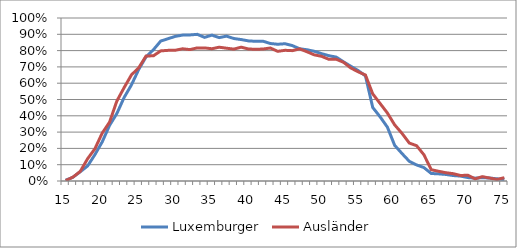
| Category | Luxemburger | Ausländer |
|---|---|---|
| 15.0 | 0.005 | 0.003 |
| 16.0 | 0.023 | 0.024 |
| 17.0 | 0.057 | 0.059 |
| 18.0 | 0.092 | 0.137 |
| 19.0 | 0.162 | 0.198 |
| 20.0 | 0.24 | 0.294 |
| 21.0 | 0.341 | 0.361 |
| 22.0 | 0.414 | 0.49 |
| 23.0 | 0.513 | 0.573 |
| 24.0 | 0.59 | 0.651 |
| 25.0 | 0.685 | 0.695 |
| 26.0 | 0.762 | 0.767 |
| 27.0 | 0.805 | 0.768 |
| 28.0 | 0.858 | 0.798 |
| 29.0 | 0.873 | 0.801 |
| 30.0 | 0.887 | 0.802 |
| 31.0 | 0.895 | 0.811 |
| 32.0 | 0.896 | 0.806 |
| 33.0 | 0.9 | 0.817 |
| 34.0 | 0.881 | 0.816 |
| 35.0 | 0.895 | 0.811 |
| 36.0 | 0.88 | 0.821 |
| 37.0 | 0.889 | 0.815 |
| 38.0 | 0.874 | 0.809 |
| 39.0 | 0.868 | 0.821 |
| 40.0 | 0.86 | 0.81 |
| 41.0 | 0.857 | 0.808 |
| 42.0 | 0.858 | 0.81 |
| 43.0 | 0.843 | 0.816 |
| 44.0 | 0.839 | 0.795 |
| 45.0 | 0.842 | 0.802 |
| 46.0 | 0.831 | 0.8 |
| 47.0 | 0.811 | 0.81 |
| 48.0 | 0.805 | 0.793 |
| 49.0 | 0.796 | 0.774 |
| 50.0 | 0.781 | 0.765 |
| 51.0 | 0.769 | 0.746 |
| 52.0 | 0.76 | 0.747 |
| 53.0 | 0.731 | 0.728 |
| 54.0 | 0.704 | 0.693 |
| 55.0 | 0.678 | 0.67 |
| 56.0 | 0.645 | 0.65 |
| 57.0 | 0.451 | 0.534 |
| 58.0 | 0.394 | 0.476 |
| 59.0 | 0.331 | 0.417 |
| 60.0 | 0.219 | 0.344 |
| 61.0 | 0.169 | 0.292 |
| 62.0 | 0.121 | 0.233 |
| 63.0 | 0.099 | 0.216 |
| 64.0 | 0.082 | 0.161 |
| 65.0 | 0.046 | 0.069 |
| 66.0 | 0.044 | 0.06 |
| 67.0 | 0.04 | 0.051 |
| 68.0 | 0.033 | 0.045 |
| 69.0 | 0.03 | 0.034 |
| 70.0 | 0.021 | 0.035 |
| 71.0 | 0.017 | 0.013 |
| 72.0 | 0.02 | 0.027 |
| 73.0 | 0.018 | 0.018 |
| 74.0 | 0.013 | 0.01 |
| 75.0 | 0.01 | 0.02 |